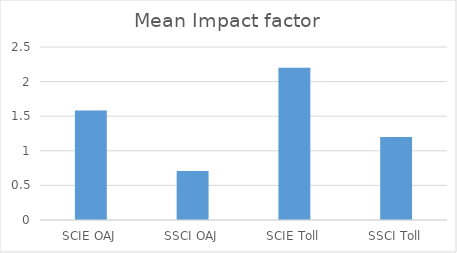
| Category | Series 0 |
|---|---|
| SCIE OAJ | 1.581 |
| SSCI OAJ | 0.707 |
| SCIE Toll | 2.2 |
| SSCI Toll | 1.199 |